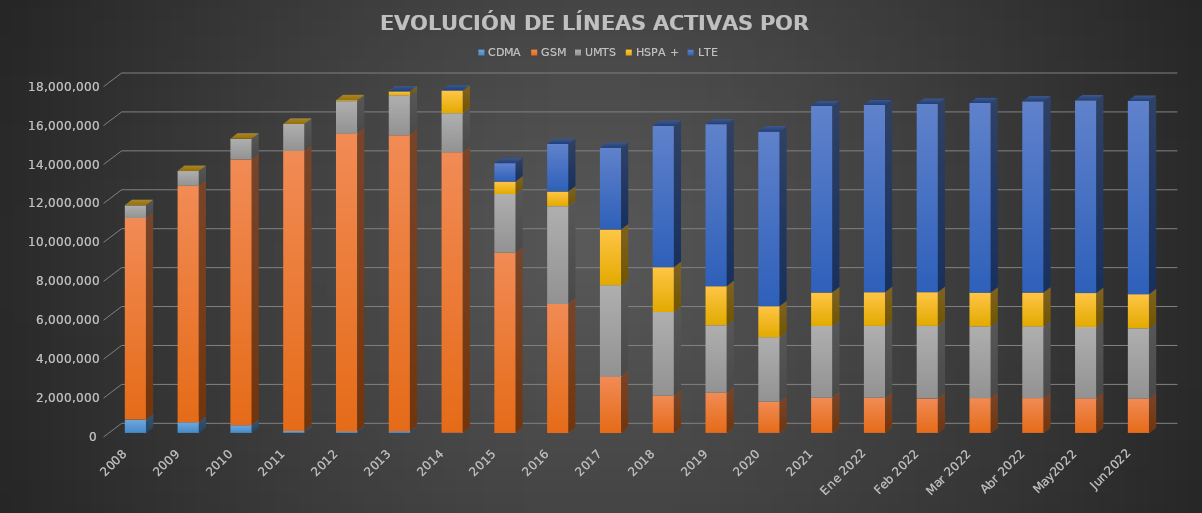
| Category | CDMA | GSM | UMTS | HSPA + | LTE |
|---|---|---|---|---|---|
| 2008 | 688357 | 10346902 | 656989 | 0 | 0 |
| 2009 | 544313 | 12151710 | 758577 | 0 | 0 |
| 2010 | 389834 | 13657394 | 1071603 | 0 | 0 |
| 2011 | 102115 | 14379423 | 1393020 | 0 | 0 |
| 2012 | 75179 | 15310006 | 1658596 | 43082 | 0 |
| 2013 | 83748 | 15215287 | 2043321 | 199398 | 0 |
| 2014 | 3009 | 14418144 | 2006405 | 1148823 | 28176 |
| 2015 | 0 | 9252920 | 3019889 | 636488 | 949723 |
| 2016 | 0 | 6621574 | 5027714 | 748032 | 2450814 |
| 2017 | 0 | 2903370.634 | 4688270.066 | 2852941.199 | 4206822.101 |
| 2018 | 0 | 1909938.891 | 4302462.415 | 2301651 | 7258785.694 |
| 2019 | 0 | 2068130.505 | 3468519.705 | 1995507 | 8320942.79 |
| 2020 | 0 | 1595680.621 | 3315009.099 | 1591073 | 8983603.28 |
| 2021 | 0 | 1804531 | 3688873 | 1717066 | 9579130 |
| Ene 2022 | 0 | 1805568.915 | 3691993.367 | 1724655 | 9625971.718 |
| Feb 2022 | 0 | 1766433.449 | 3732997.987 | 1730603 | 9675803.564 |
| Mar 2022 | 0 | 1788524.686 | 3683797.748 | 1734523 | 9742847.566 |
| Abr 2022 | 0 | 1787551.615 | 3681280.387 | 1738734 | 9820230.999 |
| May2022 | 0 | 1778055.41 | 3660016.984 | 1744330 | 9902399.607 |
| Jun2022 | 0 | 1757626.897 | 3624197.892 | 1745386 | 9928728.21 |